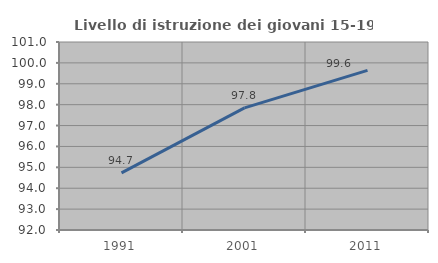
| Category | Livello di istruzione dei giovani 15-19 anni |
|---|---|
| 1991.0 | 94.737 |
| 2001.0 | 97.849 |
| 2011.0 | 99.644 |